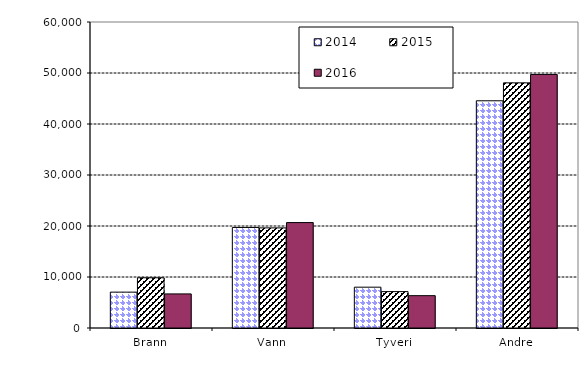
| Category | 2014 | 2015 | 2016 |
|---|---|---|---|
| Brann | 7032 | 9848 | 6682.536 |
| Vann | 19713 | 19630 | 20668.166 |
| Tyveri | 8004 | 7135 | 6340.736 |
| Andre | 44550 | 48068 | 49716.318 |